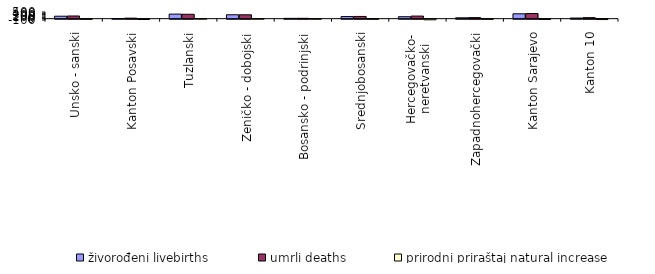
| Category | živorođeni livebirths | umrli deaths | prirodni priraštaj natural increase |
|---|---|---|---|
| Unsko - sanski | 184 | 200 | -16 |
| Kanton Posavski | 11 | 38 | -27 |
| Tuzlanski | 342 | 330 | 12 |
| Zeničko - dobojski | 293 | 291 | 2 |
| Bosansko - podrinjski | 23 | 26 | -3 |
| Srednjobosanski | 156 | 167 | -11 |
| Hercegovačko-
neretvanski | 147 | 195 | -48 |
| Zapadnohercegovački | 65 | 79 | -14 |
| Kanton Sarajevo | 365 | 387 | -22 |
| Kanton 10 | 46 | 75 | -29 |